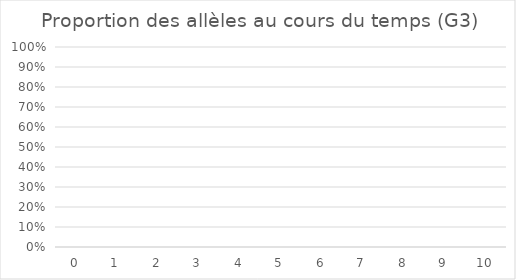
| Category | fréquence de l'allèle "D" 
dans la population ' en %) | fréquence de l'allèle "d" 
dans la population ( en %) |
|---|---|---|
| 0.0 | 0 | 0 |
| 1.0 | 0 | 0 |
| 2.0 | 0 | 0 |
| 3.0 | 0 | 0 |
| 4.0 | 0 | 0 |
| 5.0 | 0 | 0 |
| 6.0 | 0 | 0 |
| 7.0 | 0 | 0 |
| 8.0 | 0 | 0 |
| 9.0 | 0 | 0 |
| 10.0 | 0 | 0 |